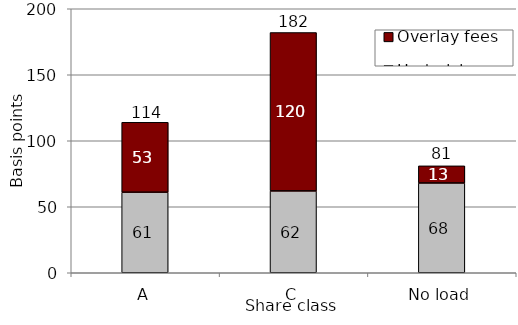
| Category | Underlying fees | Overlay fees |
|---|---|---|
| A | 61 | 53 |
| C | 62 | 120 |
| No load | 68 | 13 |